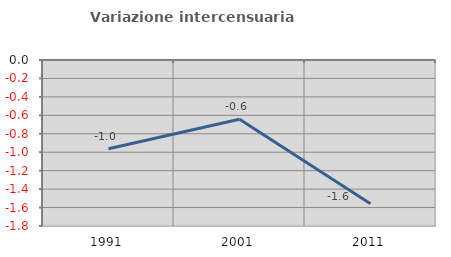
| Category | Variazione intercensuaria annua |
|---|---|
| 1991.0 | -0.963 |
| 2001.0 | -0.642 |
| 2011.0 | -1.558 |